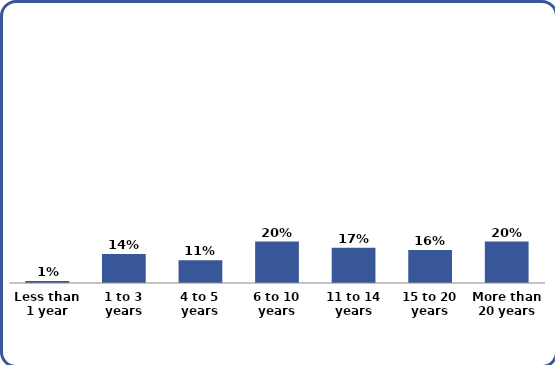
| Category | Series 0 |
|---|---|
| Less than 1 year | 0.01 |
| 1 to 3 years | 0.14 |
| 4 to 5 years | 0.11 |
| 6 to 10 years | 0.2 |
| 11 to 14 years | 0.17 |
| 15 to 20 years | 0.16 |
| More than 20 years | 0.2 |